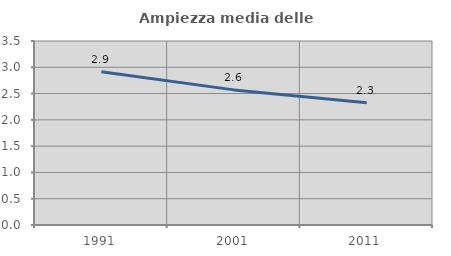
| Category | Ampiezza media delle famiglie |
|---|---|
| 1991.0 | 2.914 |
| 2001.0 | 2.57 |
| 2011.0 | 2.325 |